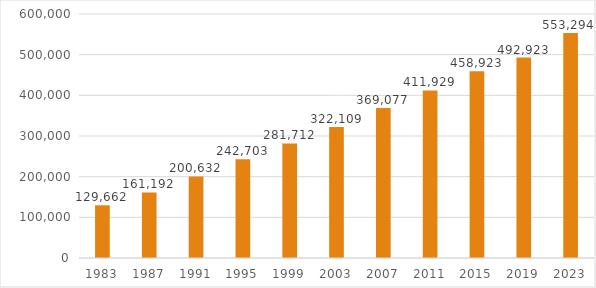
| Category | Series 0 |
|---|---|
| 1983.0 | 129662 |
| 1987.0 | 161192 |
| 1991.0 | 200632 |
| 1995.0 | 242703 |
| 1999.0 | 281712 |
| 2003.0 | 322109 |
| 2007.0 | 369077 |
| 2011.0 | 411929 |
| 2015.0 | 458923 |
| 2019.0 | 492923 |
| 2023.0 | 553294 |